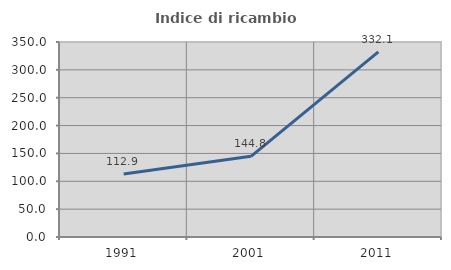
| Category | Indice di ricambio occupazionale  |
|---|---|
| 1991.0 | 112.934 |
| 2001.0 | 144.792 |
| 2011.0 | 332.117 |